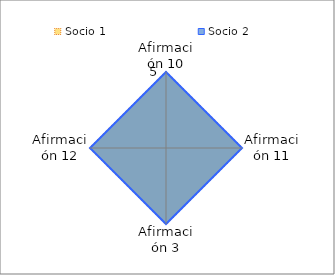
| Category | Socio 1 | Socio 2 |
|---|---|---|
| Afirmación 10 | 5 | 5 |
| Afirmación 11 | 5 | 5 |
| Afirmación 3 | 5 | 5 |
| Afirmación 12 | 5 | 5 |